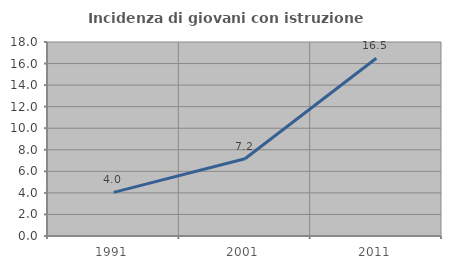
| Category | Incidenza di giovani con istruzione universitaria |
|---|---|
| 1991.0 | 4.049 |
| 2001.0 | 7.166 |
| 2011.0 | 16.492 |